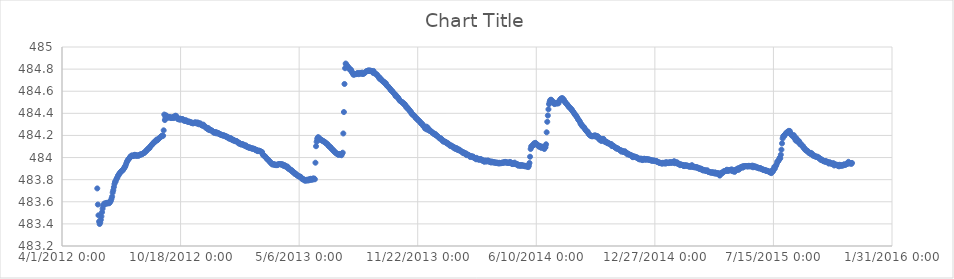
| Category | Series 0 |
|---|---|
| 41059.5 | 483.721 |
| 41060.5 | 483.575 |
| 41061.5 | 483.478 |
| 41062.5 | 483.421 |
| 41063.5 | 483.399 |
| 41064.5 | 483.413 |
| 41065.5 | 483.437 |
| 41066.5 | 483.468 |
| 41067.5 | 483.506 |
| 41068.5 | 483.538 |
| 41069.5 | 483.564 |
| 41070.5 | 483.576 |
| 41071.5 | 483.584 |
| 41072.5 | 483.583 |
| 41073.5 | 483.584 |
| 41074.5 | 483.584 |
| 41075.5 | 483.59 |
| 41076.5 | 483.584 |
| 41077.5 | 483.592 |
| 41078.5 | 483.59 |
| 41079.5 | 483.587 |
| 41080.5 | 483.594 |
| 41081.5 | 483.601 |
| 41082.5 | 483.612 |
| 41083.5 | 483.628 |
| 41084.5 | 483.647 |
| 41085.5 | 483.683 |
| 41086.5 | 483.705 |
| 41087.5 | 483.733 |
| 41088.5 | 483.761 |
| 41089.5 | 483.78 |
| 41090.5 | 483.784 |
| 41091.5 | 483.801 |
| 41092.5 | 483.814 |
| 41093.5 | 483.82 |
| 41094.5 | 483.837 |
| 41095.5 | 483.841 |
| 41096.5 | 483.853 |
| 41097.5 | 483.86 |
| 41098.5 | 483.865 |
| 41099.5 | 483.872 |
| 41100.5 | 483.879 |
| 41101.5 | 483.883 |
| 41102.5 | 483.884 |
| 41103.5 | 483.895 |
| 41104.5 | 483.901 |
| 41105.5 | 483.914 |
| 41106.5 | 483.916 |
| 41107.5 | 483.931 |
| 41108.5 | 483.949 |
| 41109.5 | 483.962 |
| 41110.5 | 483.971 |
| 41111.5 | 483.981 |
| 41112.5 | 483.987 |
| 41113.5 | 483.992 |
| 41114.5 | 484.004 |
| 41115.5 | 484.005 |
| 41116.5 | 484.014 |
| 41117.5 | 484.018 |
| 41118.5 | 484.018 |
| 41119.5 | 484.013 |
| 41120.5 | 484.014 |
| 41121.5 | 484.021 |
| 41122.5 | 484.025 |
| 41123.5 | 484.024 |
| 41124.5 | 484.017 |
| 41125.5 | 484.016 |
| 41126.5 | 484.019 |
| 41127.5 | 484.02 |
| 41128.5 | 484.017 |
| 41129.5 | 484.018 |
| 41130.5 | 484.021 |
| 41131.5 | 484.026 |
| 41132.5 | 484.029 |
| 41133.5 | 484.027 |
| 41134.5 | 484.03 |
| 41135.5 | 484.034 |
| 41136.5 | 484.036 |
| 41137.5 | 484.04 |
| 41138.5 | 484.042 |
| 41139.5 | 484.046 |
| 41140.5 | 484.054 |
| 41141.5 | 484.059 |
| 41142.5 | 484.06 |
| 41143.5 | 484.071 |
| 41144.5 | 484.074 |
| 41145.5 | 484.083 |
| 41146.5 | 484.083 |
| 41147.5 | 484.084 |
| 41148.5 | 484.097 |
| 41149.5 | 484.103 |
| 41150.5 | 484.109 |
| 41151.5 | 484.114 |
| 41152.5 | 484.123 |
| 41153.5 | 484.124 |
| 41154.5 | 484.135 |
| 41155.5 | 484.141 |
| 41156.5 | 484.145 |
| 41157.5 | 484.144 |
| 41158.5 | 484.151 |
| 41159.5 | 484.162 |
| 41160.5 | 484.158 |
| 41161.5 | 484.16 |
| 41162.5 | 484.166 |
| 41163.5 | 484.173 |
| 41164.5 | 484.179 |
| 41165.5 | 484.182 |
| 41166.5 | 484.187 |
| 41167.5 | 484.191 |
| 41168.5 | 484.195 |
| 41169.5 | 484.2 |
| 41170.5 | 484.197 |
| 41171.5 | 484.246 |
| 41172.5 | 484.389 |
| 41173.5 | 484.339 |
| 41174.5 | 484.363 |
| 41175.5 | 484.382 |
| 41176.5 | 484.377 |
| 41177.5 | 484.366 |
| 41178.5 | 484.36 |
| 41179.5 | 484.364 |
| 41180.5 | 484.365 |
| 41181.5 | 484.367 |
| 41182.5 | 484.364 |
| 41183.5 | 484.358 |
| 41184.5 | 484.358 |
| 41185.5 | 484.362 |
| 41186.5 | 484.362 |
| 41187.5 | 484.367 |
| 41188.5 | 484.357 |
| 41189.5 | 484.362 |
| 41190.5 | 484.375 |
| 41191.5 | 484.378 |
| 41192.5 | 484.376 |
| 41193.5 | 484.364 |
| 41194.5 | 484.359 |
| 41195.5 | 484.347 |
| 41196.5 | 484.347 |
| 41197.5 | 484.345 |
| 41198.5 | 484.353 |
| 41199.5 | 484.342 |
| 41200.5 | 484.348 |
| 41201.5 | 484.347 |
| 41202.5 | 484.346 |
| 41203.5 | 484.348 |
| 41204.5 | 484.342 |
| 41205.5 | 484.334 |
| 41206.5 | 484.336 |
| 41207.5 | 484.331 |
| 41208.5 | 484.337 |
| 41209.5 | 484.336 |
| 41210.5 | 484.331 |
| 41211.5 | 484.325 |
| 41212.5 | 484.324 |
| 41213.5 | 484.325 |
| 41214.5 | 484.324 |
| 41215.5 | 484.323 |
| 41216.5 | 484.319 |
| 41217.5 | 484.318 |
| 41218.5 | 484.313 |
| 41219.5 | 484.316 |
| 41220.5 | 484.309 |
| 41221.5 | 484.311 |
| 41222.5 | 484.311 |
| 41223.5 | 484.316 |
| 41224.5 | 484.318 |
| 41225.5 | 484.315 |
| 41226.5 | 484.312 |
| 41227.5 | 484.307 |
| 41228.5 | 484.318 |
| 41229.5 | 484.312 |
| 41230.5 | 484.301 |
| 41231.5 | 484.308 |
| 41232.5 | 484.307 |
| 41233.5 | 484.309 |
| 41234.5 | 484.296 |
| 41235.5 | 484.297 |
| 41236.5 | 484.288 |
| 41237.5 | 484.291 |
| 41238.5 | 484.298 |
| 41239.5 | 484.286 |
| 41240.5 | 484.281 |
| 41241.5 | 484.279 |
| 41242.5 | 484.269 |
| 41243.5 | 484.271 |
| 41244.5 | 484.265 |
| 41245.5 | 484.258 |
| 41246.5 | 484.267 |
| 41247.5 | 484.253 |
| 41248.5 | 484.248 |
| 41249.5 | 484.254 |
| 41250.5 | 484.25 |
| 41251.5 | 484.247 |
| 41252.5 | 484.244 |
| 41253.5 | 484.241 |
| 41254.5 | 484.234 |
| 41255.5 | 484.227 |
| 41256.5 | 484.23 |
| 41257.5 | 484.222 |
| 41258.5 | 484.231 |
| 41259.5 | 484.227 |
| 41260.5 | 484.219 |
| 41261.5 | 484.227 |
| 41262.5 | 484.221 |
| 41263.5 | 484.222 |
| 41264.5 | 484.214 |
| 41265.5 | 484.215 |
| 41266.5 | 484.213 |
| 41267.5 | 484.206 |
| 41268.5 | 484.208 |
| 41269.5 | 484.204 |
| 41270.5 | 484.201 |
| 41271.5 | 484.198 |
| 41272.5 | 484.201 |
| 41273.5 | 484.2 |
| 41274.5 | 484.196 |
| 41275.5 | 484.195 |
| 41276.5 | 484.188 |
| 41277.5 | 484.191 |
| 41278.5 | 484.183 |
| 41279.5 | 484.184 |
| 41280.5 | 484.182 |
| 41281.5 | 484.172 |
| 41282.5 | 484.176 |
| 41283.5 | 484.169 |
| 41284.5 | 484.176 |
| 41285.5 | 484.171 |
| 41286.5 | 484.161 |
| 41287.5 | 484.159 |
| 41288.5 | 484.163 |
| 41289.5 | 484.153 |
| 41290.5 | 484.155 |
| 41291.5 | 484.152 |
| 41292.5 | 484.147 |
| 41293.5 | 484.149 |
| 41294.5 | 484.148 |
| 41295.5 | 484.145 |
| 41296.5 | 484.139 |
| 41297.5 | 484.129 |
| 41298.5 | 484.135 |
| 41299.5 | 484.125 |
| 41300.5 | 484.125 |
| 41301.5 | 484.123 |
| 41302.5 | 484.117 |
| 41303.5 | 484.123 |
| 41304.5 | 484.12 |
| 41305.5 | 484.115 |
| 41306.5 | 484.116 |
| 41307.5 | 484.11 |
| 41308.5 | 484.107 |
| 41309.5 | 484.107 |
| 41310.5 | 484.11 |
| 41311.5 | 484.098 |
| 41312.5 | 484.096 |
| 41313.5 | 484.094 |
| 41314.5 | 484.093 |
| 41315.5 | 484.088 |
| 41316.5 | 484.093 |
| 41317.5 | 484.087 |
| 41318.5 | 484.087 |
| 41319.5 | 484.084 |
| 41320.5 | 484.08 |
| 41321.5 | 484.082 |
| 41322.5 | 484.081 |
| 41323.5 | 484.078 |
| 41324.5 | 484.079 |
| 41325.5 | 484.075 |
| 41326.5 | 484.066 |
| 41327.5 | 484.07 |
| 41328.5 | 484.067 |
| 41329.5 | 484.061 |
| 41330.5 | 484.058 |
| 41331.5 | 484.064 |
| 41332.5 | 484.061 |
| 41333.5 | 484.059 |
| 41334.5 | 484.057 |
| 41335.5 | 484.054 |
| 41336.5 | 484.049 |
| 41337.5 | 484.05 |
| 41338.5 | 484.032 |
| 41339.5 | 484.021 |
| 41340.5 | 484.017 |
| 41341.5 | 484.016 |
| 41342.5 | 484.01 |
| 41343.5 | 484.004 |
| 41344.5 | 483.996 |
| 41345.5 | 483.989 |
| 41346.5 | 483.984 |
| 41347.5 | 483.982 |
| 41348.5 | 483.973 |
| 41349.5 | 483.969 |
| 41350.5 | 483.963 |
| 41351.5 | 483.956 |
| 41352.5 | 483.952 |
| 41353.5 | 483.946 |
| 41354.5 | 483.938 |
| 41355.5 | 483.938 |
| 41356.5 | 483.941 |
| 41357.5 | 483.939 |
| 41358.5 | 483.934 |
| 41359.5 | 483.937 |
| 41360.5 | 483.932 |
| 41361.5 | 483.935 |
| 41362.5 | 483.931 |
| 41363.5 | 483.933 |
| 41364.5 | 483.939 |
| 41365.5 | 483.939 |
| 41366.5 | 483.941 |
| 41367.5 | 483.941 |
| 41368.5 | 483.94 |
| 41369.5 | 483.938 |
| 41370.5 | 483.936 |
| 41371.5 | 483.94 |
| 41372.5 | 483.935 |
| 41373.5 | 483.926 |
| 41374.5 | 483.926 |
| 41375.5 | 483.932 |
| 41376.5 | 483.921 |
| 41377.5 | 483.923 |
| 41378.5 | 483.914 |
| 41379.5 | 483.918 |
| 41380.5 | 483.918 |
| 41381.5 | 483.9 |
| 41382.5 | 483.902 |
| 41383.5 | 483.894 |
| 41384.5 | 483.891 |
| 41385.5 | 483.891 |
| 41386.5 | 483.888 |
| 41387.5 | 483.877 |
| 41388.5 | 483.881 |
| 41389.5 | 483.868 |
| 41390.5 | 483.869 |
| 41391.5 | 483.862 |
| 41392.5 | 483.853 |
| 41393.5 | 483.857 |
| 41394.5 | 483.85 |
| 41395.5 | 483.847 |
| 41396.5 | 483.839 |
| 41397.5 | 483.837 |
| 41398.5 | 483.832 |
| 41399.5 | 483.83 |
| 41400.5 | 483.827 |
| 41401.5 | 483.828 |
| 41402.5 | 483.826 |
| 41403.5 | 483.815 |
| 41404.5 | 483.81 |
| 41405.5 | 483.804 |
| 41406.5 | 483.804 |
| 41407.5 | 483.806 |
| 41408.5 | 483.795 |
| 41409.5 | 483.793 |
| 41410.5 | 483.792 |
| 41411.5 | 483.793 |
| 41412.5 | 483.798 |
| 41413.5 | 483.793 |
| 41414.5 | 483.801 |
| 41415.5 | 483.793 |
| 41416.5 | 483.795 |
| 41417.5 | 483.805 |
| 41418.5 | 483.798 |
| 41419.5 | 483.808 |
| 41420.5 | 483.802 |
| 41421.5 | 483.801 |
| 41422.5 | 483.801 |
| 41423.5 | 483.811 |
| 41424.5 | 483.805 |
| 41425.5 | 483.81 |
| 41426.5 | 483.803 |
| 41427.5 | 483.953 |
| 41428.5 | 484.102 |
| 41429.5 | 484.143 |
| 41430.5 | 484.169 |
| 41431.5 | 484.182 |
| 41432.5 | 484.184 |
| 41433.5 | 484.171 |
| 41434.5 | 484.173 |
| 41435.5 | 484.16 |
| 41436.5 | 484.162 |
| 41437.5 | 484.157 |
| 41438.5 | 484.157 |
| 41439.5 | 484.151 |
| 41440.5 | 484.149 |
| 41441.5 | 484.145 |
| 41442.5 | 484.142 |
| 41443.5 | 484.141 |
| 41444.5 | 484.132 |
| 41445.5 | 484.129 |
| 41446.5 | 484.126 |
| 41447.5 | 484.12 |
| 41448.5 | 484.118 |
| 41449.5 | 484.106 |
| 41450.5 | 484.102 |
| 41451.5 | 484.097 |
| 41452.5 | 484.097 |
| 41453.5 | 484.087 |
| 41454.5 | 484.083 |
| 41455.5 | 484.074 |
| 41456.5 | 484.072 |
| 41457.5 | 484.067 |
| 41458.5 | 484.057 |
| 41459.5 | 484.057 |
| 41460.5 | 484.049 |
| 41461.5 | 484.043 |
| 41462.5 | 484.038 |
| 41463.5 | 484.035 |
| 41464.5 | 484.034 |
| 41465.5 | 484.028 |
| 41466.5 | 484.024 |
| 41467.5 | 484.032 |
| 41468.5 | 484.031 |
| 41469.5 | 484.026 |
| 41470.5 | 484.029 |
| 41471.5 | 484.021 |
| 41472.5 | 484.036 |
| 41473.5 | 484.044 |
| 41474.5 | 484.218 |
| 41475.5 | 484.412 |
| 41476.5 | 484.665 |
| 41477.5 | 484.808 |
| 41478.5 | 484.85 |
| 41479.5 | 484.843 |
| 41480.5 | 484.833 |
| 41481.5 | 484.826 |
| 41482.5 | 484.819 |
| 41483.5 | 484.813 |
| 41484.5 | 484.806 |
| 41485.5 | 484.802 |
| 41486.5 | 484.788 |
| 41487.5 | 484.794 |
| 41488.5 | 484.782 |
| 41489.5 | 484.769 |
| 41490.5 | 484.763 |
| 41491.5 | 484.749 |
| 41492.5 | 484.751 |
| 41493.5 | 484.753 |
| 41494.5 | 484.756 |
| 41495.5 | 484.754 |
| 41496.5 | 484.757 |
| 41497.5 | 484.76 |
| 41498.5 | 484.763 |
| 41499.5 | 484.763 |
| 41500.5 | 484.754 |
| 41501.5 | 484.759 |
| 41502.5 | 484.763 |
| 41503.5 | 484.762 |
| 41504.5 | 484.764 |
| 41505.5 | 484.758 |
| 41506.5 | 484.768 |
| 41507.5 | 484.757 |
| 41508.5 | 484.757 |
| 41509.5 | 484.764 |
| 41510.5 | 484.766 |
| 41511.5 | 484.77 |
| 41512.5 | 484.776 |
| 41513.5 | 484.781 |
| 41514.5 | 484.782 |
| 41515.5 | 484.782 |
| 41516.5 | 484.788 |
| 41517.5 | 484.786 |
| 41518.5 | 484.783 |
| 41519.5 | 484.788 |
| 41520.5 | 484.783 |
| 41521.5 | 484.784 |
| 41522.5 | 484.781 |
| 41523.5 | 484.776 |
| 41524.5 | 484.767 |
| 41525.5 | 484.783 |
| 41526.5 | 484.763 |
| 41527.5 | 484.765 |
| 41528.5 | 484.759 |
| 41529.5 | 484.756 |
| 41530.5 | 484.753 |
| 41531.5 | 484.747 |
| 41532.5 | 484.74 |
| 41533.5 | 484.731 |
| 41534.5 | 484.73 |
| 41535.5 | 484.713 |
| 41536.5 | 484.719 |
| 41537.5 | 484.713 |
| 41538.5 | 484.701 |
| 41539.5 | 484.701 |
| 41540.5 | 484.692 |
| 41541.5 | 484.69 |
| 41542.5 | 484.681 |
| 41543.5 | 484.684 |
| 41544.5 | 484.676 |
| 41545.5 | 484.667 |
| 41546.5 | 484.671 |
| 41547.5 | 484.655 |
| 41548.5 | 484.648 |
| 41549.5 | 484.647 |
| 41550.5 | 484.641 |
| 41551.5 | 484.631 |
| 41552.5 | 484.627 |
| 41553.5 | 484.623 |
| 41554.5 | 484.61 |
| 41555.5 | 484.607 |
| 41556.5 | 484.604 |
| 41557.5 | 484.597 |
| 41558.5 | 484.589 |
| 41559.5 | 484.584 |
| 41560.5 | 484.578 |
| 41561.5 | 484.573 |
| 41562.5 | 484.557 |
| 41563.5 | 484.564 |
| 41564.5 | 484.552 |
| 41565.5 | 484.545 |
| 41566.5 | 484.545 |
| 41567.5 | 484.535 |
| 41568.5 | 484.527 |
| 41569.5 | 484.517 |
| 41570.5 | 484.512 |
| 41571.5 | 484.509 |
| 41572.5 | 484.504 |
| 41573.5 | 484.501 |
| 41574.5 | 484.5 |
| 41575.5 | 484.491 |
| 41576.5 | 484.482 |
| 41577.5 | 484.486 |
| 41578.5 | 484.481 |
| 41579.5 | 484.47 |
| 41580.5 | 484.456 |
| 41581.5 | 484.451 |
| 41582.5 | 484.454 |
| 41583.5 | 484.441 |
| 41584.5 | 484.435 |
| 41585.5 | 484.434 |
| 41586.5 | 484.421 |
| 41587.5 | 484.42 |
| 41588.5 | 484.414 |
| 41589.5 | 484.398 |
| 41590.5 | 484.397 |
| 41591.5 | 484.388 |
| 41592.5 | 484.383 |
| 41593.5 | 484.383 |
| 41594.5 | 484.375 |
| 41595.5 | 484.369 |
| 41596.5 | 484.359 |
| 41597.5 | 484.355 |
| 41598.5 | 484.353 |
| 41599.5 | 484.347 |
| 41600.5 | 484.338 |
| 41601.5 | 484.334 |
| 41602.5 | 484.332 |
| 41603.5 | 484.325 |
| 41604.5 | 484.319 |
| 41605.5 | 484.308 |
| 41606.5 | 484.309 |
| 41607.5 | 484.303 |
| 41608.5 | 484.297 |
| 41609.5 | 484.284 |
| 41610.5 | 484.281 |
| 41611.5 | 484.276 |
| 41612.5 | 484.262 |
| 41613.5 | 484.268 |
| 41614.5 | 484.28 |
| 41615.5 | 484.253 |
| 41616.5 | 484.273 |
| 41617.5 | 484.263 |
| 41618.5 | 484.251 |
| 41619.5 | 484.244 |
| 41620.5 | 484.242 |
| 41621.5 | 484.244 |
| 41622.5 | 484.236 |
| 41623.5 | 484.23 |
| 41624.5 | 484.227 |
| 41625.5 | 484.225 |
| 41626.5 | 484.219 |
| 41627.5 | 484.212 |
| 41628.5 | 484.21 |
| 41629.5 | 484.214 |
| 41630.5 | 484.202 |
| 41631.5 | 484.202 |
| 41632.5 | 484.195 |
| 41633.5 | 484.193 |
| 41634.5 | 484.188 |
| 41635.5 | 484.183 |
| 41636.5 | 484.174 |
| 41637.5 | 484.176 |
| 41638.5 | 484.176 |
| 41639.5 | 484.165 |
| 41640.5 | 484.164 |
| 41641.5 | 484.162 |
| 41642.5 | 484.148 |
| 41643.5 | 484.144 |
| 41644.5 | 484.146 |
| 41645.5 | 484.146 |
| 41646.5 | 484.14 |
| 41647.5 | 484.141 |
| 41648.5 | 484.131 |
| 41649.5 | 484.126 |
| 41650.5 | 484.131 |
| 41651.5 | 484.126 |
| 41652.5 | 484.122 |
| 41653.5 | 484.111 |
| 41654.5 | 484.113 |
| 41655.5 | 484.104 |
| 41656.5 | 484.11 |
| 41657.5 | 484.105 |
| 41658.5 | 484.098 |
| 41659.5 | 484.1 |
| 41660.5 | 484.091 |
| 41661.5 | 484.084 |
| 41662.5 | 484.091 |
| 41663.5 | 484.079 |
| 41664.5 | 484.08 |
| 41665.5 | 484.086 |
| 41666.5 | 484.074 |
| 41667.5 | 484.07 |
| 41668.5 | 484.074 |
| 41669.5 | 484.065 |
| 41670.5 | 484.071 |
| 41671.5 | 484.064 |
| 41672.5 | 484.059 |
| 41673.5 | 484.056 |
| 41674.5 | 484.052 |
| 41675.5 | 484.05 |
| 41676.5 | 484.04 |
| 41677.5 | 484.048 |
| 41678.5 | 484.04 |
| 41679.5 | 484.038 |
| 41680.5 | 484.03 |
| 41681.5 | 484.038 |
| 41682.5 | 484.022 |
| 41683.5 | 484.026 |
| 41684.5 | 484.026 |
| 41685.5 | 484.023 |
| 41686.5 | 484.019 |
| 41687.5 | 484.017 |
| 41688.5 | 484.005 |
| 41689.5 | 484.013 |
| 41690.5 | 484.01 |
| 41691.5 | 484.01 |
| 41692.5 | 484.004 |
| 41693.5 | 484.009 |
| 41694.5 | 484 |
| 41695.5 | 483.997 |
| 41696.5 | 483.995 |
| 41697.5 | 483.992 |
| 41698.5 | 483.984 |
| 41699.5 | 483.997 |
| 41700.5 | 483.987 |
| 41701.5 | 483.985 |
| 41702.5 | 483.983 |
| 41703.5 | 483.982 |
| 41704.5 | 483.981 |
| 41705.5 | 483.986 |
| 41706.5 | 483.983 |
| 41707.5 | 483.983 |
| 41708.5 | 483.979 |
| 41709.5 | 483.97 |
| 41710.5 | 483.974 |
| 41711.5 | 483.966 |
| 41712.5 | 483.962 |
| 41713.5 | 483.97 |
| 41714.5 | 483.974 |
| 41715.5 | 483.965 |
| 41716.5 | 483.968 |
| 41717.5 | 483.965 |
| 41718.5 | 483.974 |
| 41719.5 | 483.967 |
| 41720.5 | 483.967 |
| 41721.5 | 483.961 |
| 41722.5 | 483.965 |
| 41723.5 | 483.955 |
| 41724.5 | 483.959 |
| 41725.5 | 483.963 |
| 41726.5 | 483.956 |
| 41727.5 | 483.958 |
| 41728.5 | 483.956 |
| 41729.5 | 483.957 |
| 41730.5 | 483.954 |
| 41731.5 | 483.955 |
| 41732.5 | 483.951 |
| 41733.5 | 483.954 |
| 41734.5 | 483.952 |
| 41735.5 | 483.951 |
| 41736.5 | 483.946 |
| 41737.5 | 483.953 |
| 41738.5 | 483.95 |
| 41739.5 | 483.948 |
| 41740.5 | 483.95 |
| 41741.5 | 483.949 |
| 41742.5 | 483.955 |
| 41743.5 | 483.951 |
| 41744.5 | 483.955 |
| 41745.5 | 483.954 |
| 41746.5 | 483.959 |
| 41747.5 | 483.961 |
| 41748.5 | 483.955 |
| 41749.5 | 483.955 |
| 41750.5 | 483.957 |
| 41751.5 | 483.953 |
| 41752.5 | 483.952 |
| 41753.5 | 483.953 |
| 41754.5 | 483.951 |
| 41755.5 | 483.961 |
| 41756.5 | 483.954 |
| 41757.5 | 483.955 |
| 41758.5 | 483.946 |
| 41759.5 | 483.942 |
| 41760.5 | 483.941 |
| 41761.5 | 483.948 |
| 41762.5 | 483.946 |
| 41763.5 | 483.954 |
| 41764.5 | 483.943 |
| 41765.5 | 483.939 |
| 41766.5 | 483.941 |
| 41767.5 | 483.943 |
| 41768.5 | 483.935 |
| 41769.5 | 483.926 |
| 41770.5 | 483.932 |
| 41771.5 | 483.932 |
| 41772.5 | 483.929 |
| 41773.5 | 483.924 |
| 41774.5 | 483.931 |
| 41775.5 | 483.93 |
| 41776.5 | 483.929 |
| 41777.5 | 483.927 |
| 41778.5 | 483.926 |
| 41779.5 | 483.925 |
| 41780.5 | 483.926 |
| 41781.5 | 483.92 |
| 41782.5 | 483.923 |
| 41783.5 | 483.921 |
| 41784.5 | 483.919 |
| 41785.5 | 483.919 |
| 41786.5 | 483.914 |
| 41787.5 | 483.926 |
| 41788.5 | 483.951 |
| 41789.5 | 484.007 |
| 41790.5 | 484.078 |
| 41791.5 | 484.102 |
| 41792.5 | 484.101 |
| 41793.5 | 484.104 |
| 41794.5 | 484.117 |
| 41795.5 | 484.112 |
| 41796.5 | 484.13 |
| 41797.5 | 484.121 |
| 41798.5 | 484.133 |
| 41799.5 | 484.128 |
| 41800.5 | 484.117 |
| 41801.5 | 484.118 |
| 41802.5 | 484.115 |
| 41803.5 | 484.105 |
| 41804.5 | 484.098 |
| 41805.5 | 484.105 |
| 41806.5 | 484.104 |
| 41807.5 | 484.091 |
| 41808.5 | 484.089 |
| 41809.5 | 484.098 |
| 41810.5 | 484.097 |
| 41811.5 | 484.092 |
| 41812.5 | 484.087 |
| 41813.5 | 484.077 |
| 41814.5 | 484.091 |
| 41815.5 | 484.093 |
| 41816.5 | 484.12 |
| 41817.5 | 484.228 |
| 41818.5 | 484.324 |
| 41819.5 | 484.38 |
| 41820.5 | 484.436 |
| 41821.5 | 484.484 |
| 41822.5 | 484.504 |
| 41823.5 | 484.519 |
| 41824.5 | 484.523 |
| 41825.5 | 484.521 |
| 41826.5 | 484.508 |
| 41827.5 | 484.5 |
| 41828.5 | 484.504 |
| 41829.5 | 484.497 |
| 41830.5 | 484.484 |
| 41831.5 | 484.488 |
| 41832.5 | 484.494 |
| 41833.5 | 484.491 |
| 41834.5 | 484.49 |
| 41835.5 | 484.49 |
| 41836.5 | 484.495 |
| 41837.5 | 484.491 |
| 41838.5 | 484.51 |
| 41839.5 | 484.518 |
| 41840.5 | 484.524 |
| 41841.5 | 484.532 |
| 41842.5 | 484.535 |
| 41843.5 | 484.536 |
| 41844.5 | 484.536 |
| 41845.5 | 484.523 |
| 41846.5 | 484.524 |
| 41847.5 | 484.507 |
| 41848.5 | 484.505 |
| 41849.5 | 484.495 |
| 41850.5 | 484.489 |
| 41851.5 | 484.486 |
| 41852.5 | 484.477 |
| 41853.5 | 484.472 |
| 41854.5 | 484.461 |
| 41855.5 | 484.456 |
| 41856.5 | 484.451 |
| 41857.5 | 484.447 |
| 41858.5 | 484.441 |
| 41859.5 | 484.431 |
| 41860.5 | 484.43 |
| 41861.5 | 484.418 |
| 41862.5 | 484.413 |
| 41863.5 | 484.403 |
| 41864.5 | 484.397 |
| 41865.5 | 484.386 |
| 41866.5 | 484.383 |
| 41867.5 | 484.374 |
| 41868.5 | 484.366 |
| 41869.5 | 484.357 |
| 41870.5 | 484.346 |
| 41871.5 | 484.341 |
| 41872.5 | 484.332 |
| 41873.5 | 484.324 |
| 41874.5 | 484.309 |
| 41875.5 | 484.301 |
| 41876.5 | 484.299 |
| 41877.5 | 484.285 |
| 41878.5 | 484.28 |
| 41879.5 | 484.279 |
| 41880.5 | 484.274 |
| 41881.5 | 484.264 |
| 41882.5 | 484.255 |
| 41883.5 | 484.246 |
| 41884.5 | 484.241 |
| 41885.5 | 484.235 |
| 41886.5 | 484.236 |
| 41887.5 | 484.222 |
| 41888.5 | 484.213 |
| 41889.5 | 484.207 |
| 41890.5 | 484.205 |
| 41891.5 | 484.197 |
| 41892.5 | 484.195 |
| 41893.5 | 484.194 |
| 41894.5 | 484.192 |
| 41895.5 | 484.195 |
| 41896.5 | 484.194 |
| 41897.5 | 484.195 |
| 41898.5 | 484.202 |
| 41899.5 | 484.191 |
| 41900.5 | 484.198 |
| 41901.5 | 484.189 |
| 41902.5 | 484.194 |
| 41903.5 | 484.192 |
| 41904.5 | 484.175 |
| 41905.5 | 484.182 |
| 41906.5 | 484.162 |
| 41907.5 | 484.174 |
| 41908.5 | 484.161 |
| 41909.5 | 484.15 |
| 41910.5 | 484.166 |
| 41911.5 | 484.153 |
| 41912.5 | 484.169 |
| 41913.5 | 484.168 |
| 41914.5 | 484.15 |
| 41915.5 | 484.143 |
| 41916.5 | 484.142 |
| 41917.5 | 484.143 |
| 41918.5 | 484.143 |
| 41919.5 | 484.13 |
| 41920.5 | 484.135 |
| 41921.5 | 484.129 |
| 41922.5 | 484.126 |
| 41923.5 | 484.126 |
| 41924.5 | 484.122 |
| 41925.5 | 484.119 |
| 41926.5 | 484.122 |
| 41927.5 | 484.104 |
| 41928.5 | 484.107 |
| 41929.5 | 484.103 |
| 41930.5 | 484.106 |
| 41931.5 | 484.099 |
| 41932.5 | 484.094 |
| 41933.5 | 484.088 |
| 41934.5 | 484.089 |
| 41935.5 | 484.08 |
| 41936.5 | 484.085 |
| 41937.5 | 484.079 |
| 41938.5 | 484.078 |
| 41939.5 | 484.072 |
| 41940.5 | 484.07 |
| 41941.5 | 484.065 |
| 41942.5 | 484.066 |
| 41943.5 | 484.054 |
| 41944.5 | 484.061 |
| 41945.5 | 484.059 |
| 41946.5 | 484.052 |
| 41947.5 | 484.052 |
| 41948.5 | 484.051 |
| 41949.5 | 484.057 |
| 41950.5 | 484.044 |
| 41951.5 | 484.045 |
| 41952.5 | 484.041 |
| 41953.5 | 484.029 |
| 41954.5 | 484.037 |
| 41955.5 | 484.03 |
| 41956.5 | 484.026 |
| 41957.5 | 484.025 |
| 41958.5 | 484.025 |
| 41959.5 | 484.019 |
| 41960.5 | 484.018 |
| 41961.5 | 484.018 |
| 41962.5 | 484.004 |
| 41963.5 | 484.004 |
| 41964.5 | 484.009 |
| 41965.5 | 484.009 |
| 41966.5 | 484.007 |
| 41967.5 | 484.003 |
| 41968.5 | 484.003 |
| 41969.5 | 484 |
| 41970.5 | 483.999 |
| 41971.5 | 483.991 |
| 41972.5 | 483.991 |
| 41973.5 | 483.987 |
| 41974.5 | 483.982 |
| 41975.5 | 483.99 |
| 41976.5 | 483.984 |
| 41977.5 | 483.989 |
| 41978.5 | 483.98 |
| 41979.5 | 483.977 |
| 41980.5 | 483.984 |
| 41981.5 | 483.989 |
| 41982.5 | 483.989 |
| 41983.5 | 483.981 |
| 41984.5 | 483.981 |
| 41985.5 | 483.987 |
| 41986.5 | 483.984 |
| 41987.5 | 483.983 |
| 41988.5 | 483.982 |
| 41989.5 | 483.984 |
| 41990.5 | 483.981 |
| 41991.5 | 483.977 |
| 41992.5 | 483.98 |
| 41993.5 | 483.973 |
| 41994.5 | 483.975 |
| 41995.5 | 483.972 |
| 41996.5 | 483.971 |
| 41997.5 | 483.973 |
| 41998.5 | 483.972 |
| 41999.5 | 483.971 |
| 42000.5 | 483.97 |
| 42001.5 | 483.966 |
| 42002.5 | 483.968 |
| 42003.5 | 483.966 |
| 42004.5 | 483.959 |
| 42005.5 | 483.959 |
| 42006.5 | 483.956 |
| 42007.5 | 483.953 |
| 42008.5 | 483.952 |
| 42009.5 | 483.953 |
| 42010.5 | 483.951 |
| 42011.5 | 483.946 |
| 42012.5 | 483.946 |
| 42013.5 | 483.953 |
| 42014.5 | 483.949 |
| 42015.5 | 483.949 |
| 42016.5 | 483.951 |
| 42017.5 | 483.945 |
| 42018.5 | 483.958 |
| 42019.5 | 483.949 |
| 42020.5 | 483.956 |
| 42021.5 | 483.952 |
| 42022.5 | 483.952 |
| 42023.5 | 483.95 |
| 42024.5 | 483.957 |
| 42025.5 | 483.957 |
| 42026.5 | 483.952 |
| 42027.5 | 483.954 |
| 42028.5 | 483.959 |
| 42029.5 | 483.953 |
| 42030.5 | 483.958 |
| 42031.5 | 483.958 |
| 42032.5 | 483.967 |
| 42033.5 | 483.949 |
| 42034.5 | 483.953 |
| 42035.5 | 483.954 |
| 42036.5 | 483.958 |
| 42037.5 | 483.946 |
| 42038.5 | 483.953 |
| 42039.5 | 483.942 |
| 42040.5 | 483.941 |
| 42041.5 | 483.939 |
| 42042.5 | 483.931 |
| 42043.5 | 483.939 |
| 42044.5 | 483.934 |
| 42045.5 | 483.935 |
| 42046.5 | 483.932 |
| 42047.5 | 483.933 |
| 42048.5 | 483.924 |
| 42049.5 | 483.923 |
| 42050.5 | 483.93 |
| 42051.5 | 483.929 |
| 42052.5 | 483.927 |
| 42053.5 | 483.928 |
| 42054.5 | 483.926 |
| 42055.5 | 483.926 |
| 42056.5 | 483.921 |
| 42057.5 | 483.921 |
| 42058.5 | 483.917 |
| 42059.5 | 483.92 |
| 42060.5 | 483.919 |
| 42061.5 | 483.917 |
| 42062.5 | 483.931 |
| 42063.5 | 483.918 |
| 42064.5 | 483.917 |
| 42065.5 | 483.913 |
| 42066.5 | 483.917 |
| 42067.5 | 483.912 |
| 42068.5 | 483.912 |
| 42069.5 | 483.912 |
| 42070.5 | 483.913 |
| 42071.5 | 483.909 |
| 42072.5 | 483.905 |
| 42073.5 | 483.908 |
| 42074.5 | 483.899 |
| 42075.5 | 483.899 |
| 42076.5 | 483.901 |
| 42077.5 | 483.899 |
| 42078.5 | 483.892 |
| 42079.5 | 483.896 |
| 42080.5 | 483.886 |
| 42081.5 | 483.884 |
| 42082.5 | 483.886 |
| 42083.5 | 483.885 |
| 42084.5 | 483.883 |
| 42085.5 | 483.884 |
| 42086.5 | 483.878 |
| 42087.5 | 483.88 |
| 42088.5 | 483.885 |
| 42089.5 | 483.874 |
| 42090.5 | 483.87 |
| 42091.5 | 483.871 |
| 42092.5 | 483.869 |
| 42093.5 | 483.865 |
| 42094.5 | 483.865 |
| 42095.5 | 483.866 |
| 42096.5 | 483.862 |
| 42097.5 | 483.867 |
| 42098.5 | 483.863 |
| 42099.5 | 483.859 |
| 42100.5 | 483.857 |
| 42101.5 | 483.866 |
| 42102.5 | 483.855 |
| 42103.5 | 483.858 |
| 42104.5 | 483.854 |
| 42105.5 | 483.859 |
| 42106.5 | 483.858 |
| 42107.5 | 483.854 |
| 42108.5 | 483.844 |
| 42109.5 | 483.837 |
| 42110.5 | 483.853 |
| 42111.5 | 483.862 |
| 42112.5 | 483.854 |
| 42113.5 | 483.863 |
| 42114.5 | 483.862 |
| 42115.5 | 483.873 |
| 42116.5 | 483.874 |
| 42117.5 | 483.876 |
| 42118.5 | 483.879 |
| 42119.5 | 483.88 |
| 42120.5 | 483.882 |
| 42121.5 | 483.89 |
| 42122.5 | 483.879 |
| 42123.5 | 483.882 |
| 42124.5 | 483.886 |
| 42125.5 | 483.882 |
| 42126.5 | 483.887 |
| 42127.5 | 483.884 |
| 42128.5 | 483.889 |
| 42129.5 | 483.893 |
| 42130.5 | 483.881 |
| 42131.5 | 483.876 |
| 42132.5 | 483.879 |
| 42133.5 | 483.886 |
| 42134.5 | 483.87 |
| 42135.5 | 483.882 |
| 42136.5 | 483.887 |
| 42137.5 | 483.893 |
| 42138.5 | 483.89 |
| 42139.5 | 483.9 |
| 42140.5 | 483.888 |
| 42141.5 | 483.904 |
| 42142.5 | 483.893 |
| 42143.5 | 483.903 |
| 42144.5 | 483.912 |
| 42145.5 | 483.91 |
| 42146.5 | 483.914 |
| 42147.5 | 483.919 |
| 42148.5 | 483.909 |
| 42149.5 | 483.922 |
| 42150.5 | 483.921 |
| 42151.5 | 483.92 |
| 42152.5 | 483.922 |
| 42153.5 | 483.923 |
| 42154.5 | 483.923 |
| 42155.5 | 483.92 |
| 42156.5 | 483.922 |
| 42157.5 | 483.92 |
| 42158.5 | 483.925 |
| 42159.5 | 483.92 |
| 42160.5 | 483.924 |
| 42161.5 | 483.92 |
| 42162.5 | 483.922 |
| 42163.5 | 483.921 |
| 42164.5 | 483.927 |
| 42165.5 | 483.912 |
| 42166.5 | 483.919 |
| 42167.5 | 483.922 |
| 42168.5 | 483.914 |
| 42169.5 | 483.919 |
| 42170.5 | 483.911 |
| 42171.5 | 483.913 |
| 42172.5 | 483.91 |
| 42173.5 | 483.909 |
| 42174.5 | 483.907 |
| 42175.5 | 483.901 |
| 42176.5 | 483.904 |
| 42177.5 | 483.904 |
| 42178.5 | 483.903 |
| 42179.5 | 483.898 |
| 42180.5 | 483.897 |
| 42181.5 | 483.894 |
| 42182.5 | 483.888 |
| 42183.5 | 483.89 |
| 42184.5 | 483.888 |
| 42185.5 | 483.885 |
| 42186.5 | 483.886 |
| 42187.5 | 483.88 |
| 42188.5 | 483.881 |
| 42189.5 | 483.879 |
| 42190.5 | 483.879 |
| 42191.5 | 483.874 |
| 42192.5 | 483.873 |
| 42193.5 | 483.869 |
| 42194.5 | 483.867 |
| 42195.5 | 483.864 |
| 42196.5 | 483.859 |
| 42197.5 | 483.868 |
| 42198.5 | 483.888 |
| 42199.5 | 483.877 |
| 42200.5 | 483.892 |
| 42201.5 | 483.916 |
| 42202.5 | 483.902 |
| 42203.5 | 483.92 |
| 42204.5 | 483.928 |
| 42205.5 | 483.942 |
| 42206.5 | 483.964 |
| 42207.5 | 483.966 |
| 42208.5 | 483.97 |
| 42209.5 | 483.983 |
| 42210.5 | 483.998 |
| 42211.5 | 483.992 |
| 42212.5 | 484.025 |
| 42213.5 | 484.071 |
| 42214.5 | 484.128 |
| 42215.5 | 484.173 |
| 42216.5 | 484.191 |
| 42217.5 | 484.198 |
| 42218.5 | 484.195 |
| 42219.5 | 484.209 |
| 42220.5 | 484.213 |
| 42221.5 | 484.223 |
| 42222.5 | 484.227 |
| 42223.5 | 484.226 |
| 42224.5 | 484.23 |
| 42225.5 | 484.241 |
| 42226.5 | 484.221 |
| 42227.5 | 484.241 |
| 42228.5 | 484.225 |
| 42229.5 | 484.214 |
| 42230.5 | 484.204 |
| 42231.5 | 484.197 |
| 42232.5 | 484.196 |
| 42233.5 | 484.195 |
| 42234.5 | 484.203 |
| 42235.5 | 484.175 |
| 42236.5 | 484.171 |
| 42237.5 | 484.155 |
| 42238.5 | 484.176 |
| 42239.5 | 484.165 |
| 42240.5 | 484.144 |
| 42241.5 | 484.143 |
| 42242.5 | 484.152 |
| 42243.5 | 484.144 |
| 42244.5 | 484.124 |
| 42245.5 | 484.119 |
| 42246.5 | 484.123 |
| 42247.5 | 484.112 |
| 42248.5 | 484.106 |
| 42249.5 | 484.106 |
| 42250.5 | 484.091 |
| 42251.5 | 484.086 |
| 42252.5 | 484.084 |
| 42253.5 | 484.07 |
| 42254.5 | 484.071 |
| 42255.5 | 484.063 |
| 42256.5 | 484.06 |
| 42257.5 | 484.061 |
| 42258.5 | 484.051 |
| 42259.5 | 484.044 |
| 42260.5 | 484.04 |
| 42261.5 | 484.039 |
| 42262.5 | 484.032 |
| 42263.5 | 484.042 |
| 42264.5 | 484.031 |
| 42265.5 | 484.033 |
| 42266.5 | 484.018 |
| 42267.5 | 484.019 |
| 42268.5 | 484.016 |
| 42269.5 | 484.016 |
| 42270.5 | 484.009 |
| 42271.5 | 484.01 |
| 42272.5 | 484.008 |
| 42273.5 | 484.004 |
| 42274.5 | 484.007 |
| 42275.5 | 483.999 |
| 42276.5 | 484 |
| 42277.5 | 483.992 |
| 42278.5 | 483.99 |
| 42279.5 | 483.98 |
| 42280.5 | 483.98 |
| 42281.5 | 483.983 |
| 42282.5 | 483.976 |
| 42283.5 | 483.971 |
| 42284.5 | 483.969 |
| 42285.5 | 483.965 |
| 42286.5 | 483.969 |
| 42287.5 | 483.961 |
| 42288.5 | 483.968 |
| 42289.5 | 483.963 |
| 42290.5 | 483.957 |
| 42291.5 | 483.961 |
| 42292.5 | 483.956 |
| 42293.5 | 483.945 |
| 42294.5 | 483.955 |
| 42295.5 | 483.956 |
| 42296.5 | 483.949 |
| 42297.5 | 483.945 |
| 42298.5 | 483.944 |
| 42299.5 | 483.945 |
| 42300.5 | 483.947 |
| 42301.5 | 483.948 |
| 42302.5 | 483.928 |
| 42303.5 | 483.937 |
| 42304.5 | 483.934 |
| 42305.5 | 483.937 |
| 42306.5 | 483.934 |
| 42307.5 | 483.928 |
| 42308.5 | 483.934 |
| 42309.5 | 483.926 |
| 42310.5 | 483.92 |
| 42311.5 | 483.935 |
| 42312.5 | 483.93 |
| 42313.5 | 483.925 |
| 42314.5 | 483.931 |
| 42315.5 | 483.927 |
| 42316.5 | 483.931 |
| 42317.5 | 483.927 |
| 42318.5 | 483.936 |
| 42319.5 | 483.938 |
| 42320.5 | 483.933 |
| 42321.5 | 483.936 |
| 42322.5 | 483.937 |
| 42323.5 | 483.942 |
| 42324.5 | 483.945 |
| 42325.5 | 483.947 |
| 42326.5 | 483.961 |
| 42327.5 | 483.946 |
| 42328.5 | 483.949 |
| 42329.5 | 483.95 |
| 42330.5 | 483.948 |
| 42331.5 | 483.943 |
| 42332.5 | 483.951 |